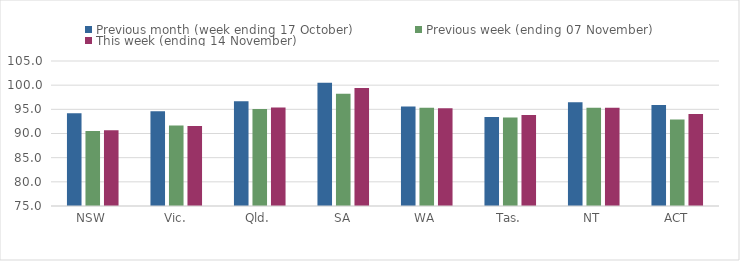
| Category | Previous month (week ending 17 October) | Previous week (ending 07 November) | This week (ending 14 November) |
|---|---|---|---|
| NSW | 94.21 | 90.53 | 90.65 |
| Vic. | 94.62 | 91.64 | 91.53 |
| Qld. | 96.69 | 95.05 | 95.4 |
| SA | 100.49 | 98.21 | 99.41 |
| WA | 95.61 | 95.31 | 95.25 |
| Tas. | 93.43 | 93.29 | 93.85 |
| NT | 96.47 | 95.34 | 95.32 |
| ACT | 95.91 | 92.88 | 94.03 |